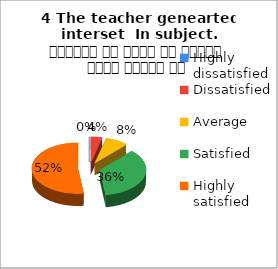
| Category | 4 The teacher genearted interset  In subject. शिक्षक ने विषय के प्रति रुचि जागृत की |
|---|---|
| Highly dissatisfied | 0 |
| Dissatisfied | 1 |
| Average | 2 |
| Satisfied | 9 |
| Highly satisfied | 13 |